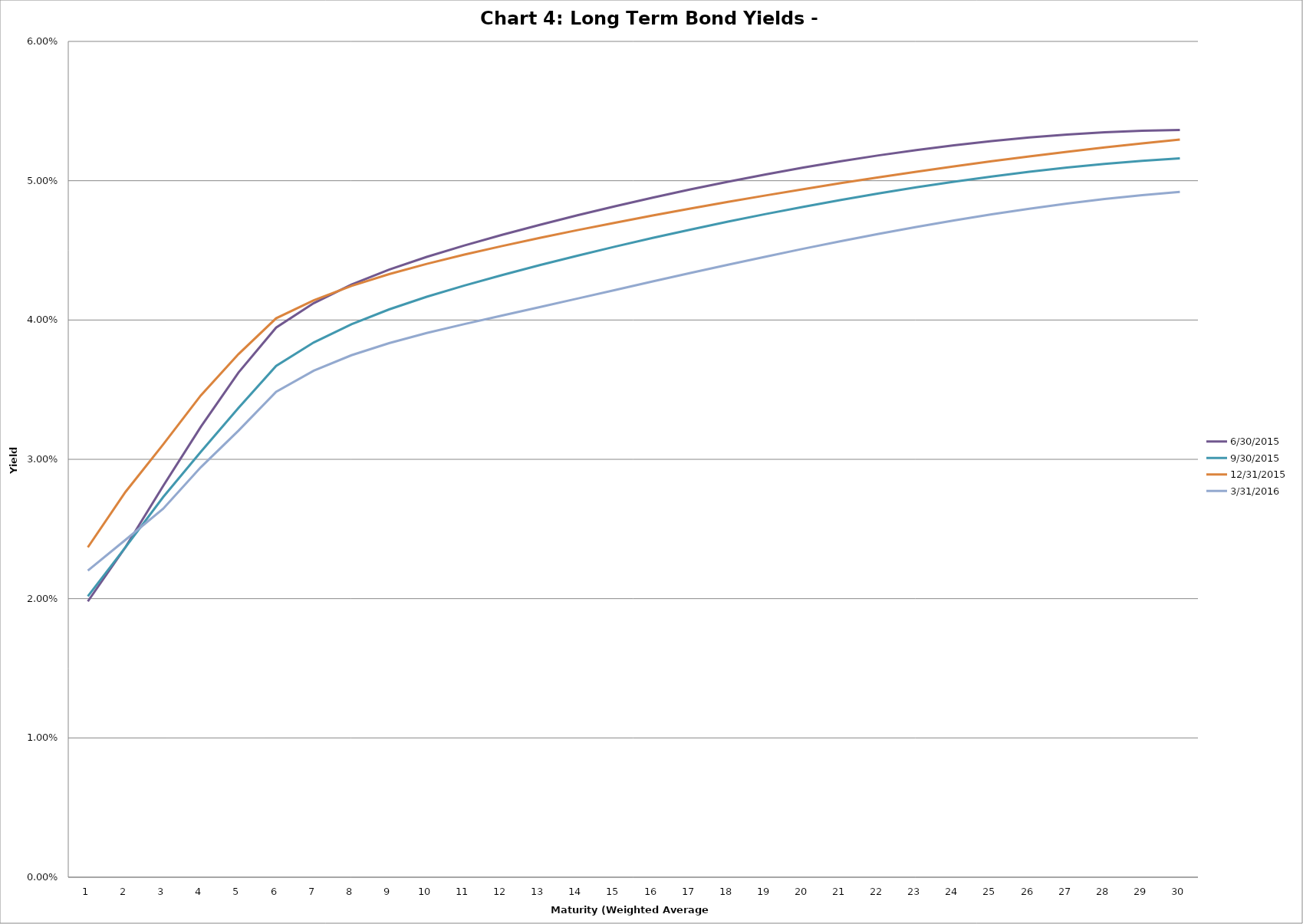
| Category | 6/30/2015 | 9/30/2015 | 12/31/2015 | 3/31/2016 |
|---|---|---|---|---|
| 0 | 0.02 | 0.02 | 0.024 | 0.022 |
| 1 | 0.024 | 0.024 | 0.028 | 0.024 |
| 2 | 0.028 | 0.027 | 0.031 | 0.026 |
| 3 | 0.032 | 0.031 | 0.035 | 0.029 |
| 4 | 0.036 | 0.034 | 0.038 | 0.032 |
| 5 | 0.039 | 0.037 | 0.04 | 0.035 |
| 6 | 0.041 | 0.038 | 0.041 | 0.036 |
| 7 | 0.043 | 0.04 | 0.042 | 0.037 |
| 8 | 0.044 | 0.041 | 0.043 | 0.038 |
| 9 | 0.045 | 0.042 | 0.044 | 0.039 |
| 10 | 0.045 | 0.042 | 0.045 | 0.04 |
| 11 | 0.046 | 0.043 | 0.045 | 0.04 |
| 12 | 0.047 | 0.044 | 0.046 | 0.041 |
| 13 | 0.048 | 0.045 | 0.046 | 0.042 |
| 14 | 0.048 | 0.045 | 0.047 | 0.042 |
| 15 | 0.049 | 0.046 | 0.048 | 0.043 |
| 16 | 0.049 | 0.046 | 0.048 | 0.043 |
| 17 | 0.05 | 0.047 | 0.048 | 0.044 |
| 18 | 0.05 | 0.048 | 0.049 | 0.045 |
| 19 | 0.051 | 0.048 | 0.049 | 0.045 |
| 20 | 0.051 | 0.049 | 0.05 | 0.046 |
| 21 | 0.052 | 0.049 | 0.05 | 0.046 |
| 22 | 0.052 | 0.05 | 0.051 | 0.047 |
| 23 | 0.053 | 0.05 | 0.051 | 0.047 |
| 24 | 0.053 | 0.05 | 0.051 | 0.048 |
| 25 | 0.053 | 0.051 | 0.052 | 0.048 |
| 26 | 0.053 | 0.051 | 0.052 | 0.048 |
| 27 | 0.053 | 0.051 | 0.052 | 0.049 |
| 28 | 0.054 | 0.051 | 0.053 | 0.049 |
| 29 | 0.054 | 0.052 | 0.053 | 0.049 |